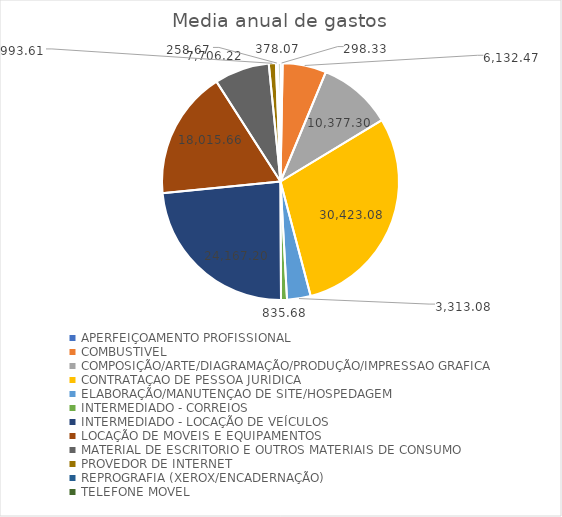
| Category | Series 0 |
|---|---|
| APERFEIÇOAMENTO PROFISSIONAL | 298.333 |
| COMBUSTIVEL | 6132.467 |
| COMPOSIÇÃO/ARTE/DIAGRAMAÇÃO/PRODUÇÃO/IMPRESSAO GRAFICA | 10377.303 |
| CONTRATAÇAO DE PESSOA JURIDICA | 30423.08 |
| ELABORAÇÃO/MANUTENÇAO DE SITE/HOSPEDAGEM | 3313.083 |
| INTERMEDIADO - CORREIOS | 835.677 |
| INTERMEDIADO - LOCAÇÃO DE VEÍCULOS | 24167.197 |
| LOCAÇÃO DE MOVEIS E EQUIPAMENTOS | 18015.663 |
| MATERIAL DE ESCRITORIO E OUTROS MATERIAIS DE CONSUMO | 7706.217 |
| PROVEDOR DE INTERNET | 993.613 |
| REPROGRAFIA (XEROX/ENCADERNAÇÃO) | 258.667 |
| TELEFONE MOVEL | 378.067 |